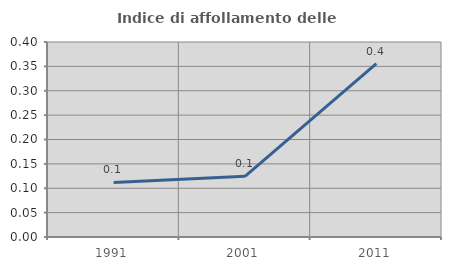
| Category | Indice di affollamento delle abitazioni  |
|---|---|
| 1991.0 | 0.112 |
| 2001.0 | 0.125 |
| 2011.0 | 0.356 |